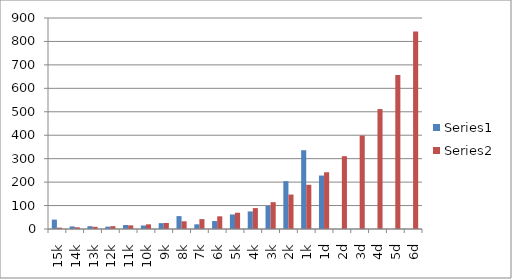
| Category | Series 0 | Series 1 |
|---|---|---|
| 15k | 40 | 5.728 |
| 14k | 11 | 7.352 |
| 13k | 12 | 9.436 |
| 12k | 10 | 12.111 |
| 11k | 17 | 15.544 |
| 10k | 15 | 19.95 |
| 9k | 25 | 25.605 |
| 8k | 55 | 32.863 |
| 7k | 20 | 42.178 |
| 6k | 34 | 54.135 |
| 5k | 62 | 69.48 |
| 4k | 75 | 89.176 |
| 3k | 98 | 114.454 |
| 2k | 204 | 146.899 |
| 1k | 336 | 188.54 |
| 1d | 228 | 241.985 |
| 2d | 0 | 310.58 |
| 3d | 0 | 398.62 |
| 4d | 0 | 511.617 |
| 5d | 0 | 656.644 |
| 6d | 0 | 842.782 |